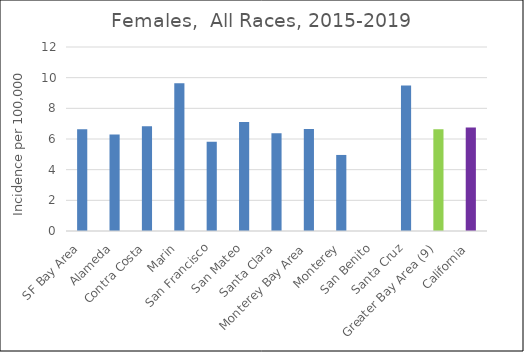
| Category | Female |
|---|---|
| SF Bay Area | 6.63 |
|   Alameda | 6.3 |
|   Contra Costa | 6.83 |
|   Marin | 9.63 |
|   San Francisco | 5.82 |
|   San Mateo | 7.11 |
|   Santa Clara | 6.38 |
| Monterey Bay Area | 6.66 |
|   Monterey | 4.96 |
|   San Benito | 0 |
|   Santa Cruz | 9.49 |
| Greater Bay Area (9) | 6.64 |
| California | 6.75 |